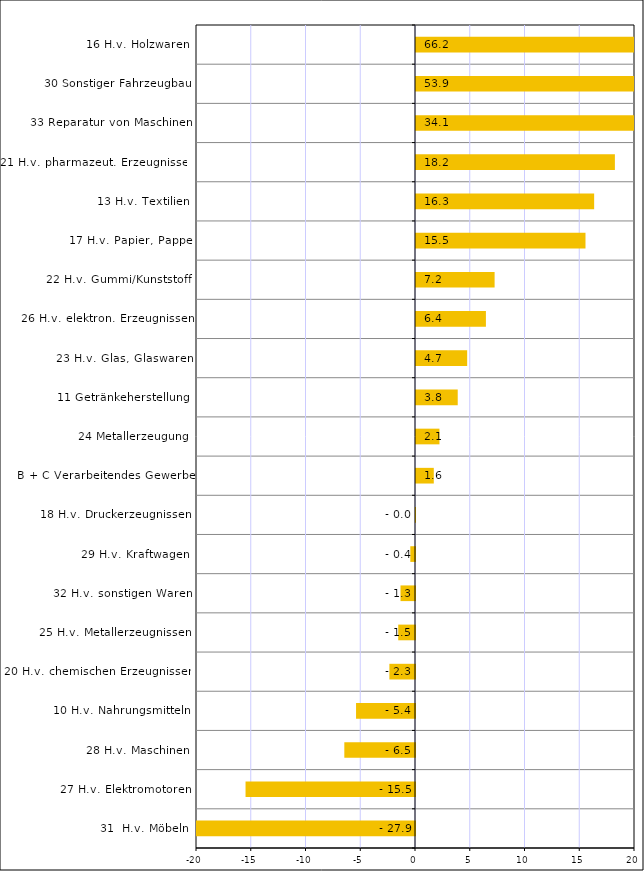
| Category | Series 0 |
|---|---|
| 31  H.v. Möbeln | -27.946 |
| 27 H.v. Elektromotoren | -15.475 |
| 28 H.v. Maschinen | -6.454 |
| 10 H.v. Nahrungsmitteln | -5.384 |
| 20 H.v. chemischen Erzeugnissen | -2.34 |
| 25 H.v. Metallerzeugnissen | -1.532 |
| 32 H.v. sonstigen Waren | -1.324 |
| 29 H.v. Kraftwagen | -0.427 |
| 18 H.v. Druckerzeugnissen | -0.012 |
| B + C Verarbeitendes Gewerbe | 1.624 |
| 24 Metallerzeugung | 2.141 |
| 11 Getränkeherstellung | 3.81 |
| 23 H.v. Glas, Glaswaren | 4.673 |
| 26 H.v. elektron. Erzeugnissen | 6.385 |
| 22 H.v. Gummi/Kunststoff | 7.178 |
| 17 H.v. Papier, Pappe | 15.479 |
| 13 H.v. Textilien | 16.27 |
| 21 H.v. pharmazeut. Erzeugnissen | 18.164 |
| 33 Reparatur von Maschinen | 34.121 |
| 30 Sonstiger Fahrzeugbau | 53.863 |
| 16 H.v. Holzwaren | 66.189 |